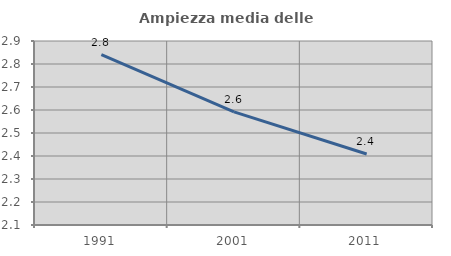
| Category | Ampiezza media delle famiglie |
|---|---|
| 1991.0 | 2.841 |
| 2001.0 | 2.592 |
| 2011.0 | 2.409 |